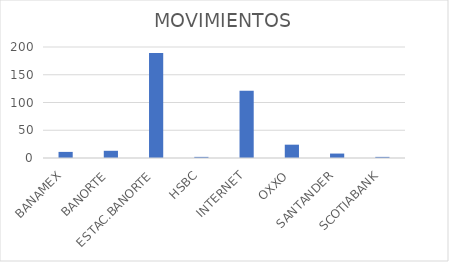
| Category | MOVIMIENTOS |
|---|---|
| BANAMEX | 11 |
| BANORTE | 13 |
| ESTAC.BANORTE | 189 |
| HSBC | 2 |
| INTERNET | 121 |
| OXXO | 24 |
| SANTANDER | 8 |
| SCOTIABANK | 2 |